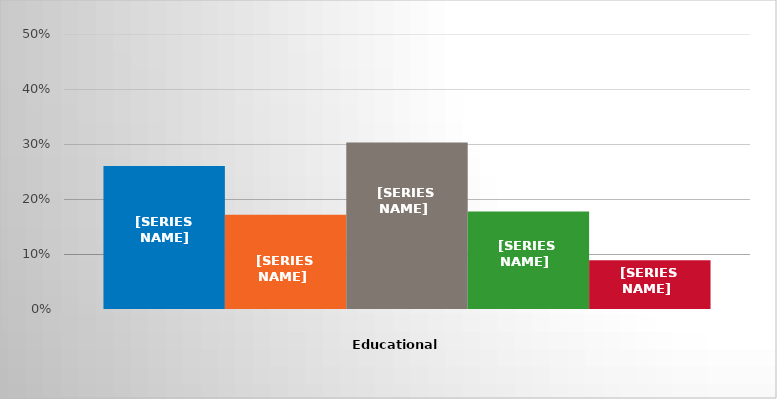
| Category | GED/High school diploma | Less than 1 year of college | 1 year of college | 2 years of college | Other |
|---|---|---|---|---|---|
| 0 | 0.26 | 0.171 | 0.303 | 0.177 | 0.089 |